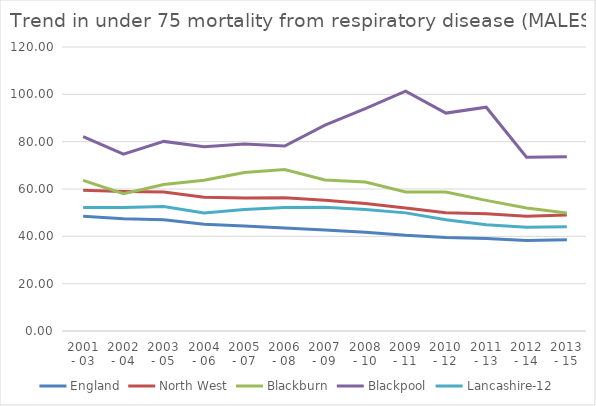
| Category | England | North West | Blackburn | Blackpool | Lancashire-12 |
|---|---|---|---|---|---|
| 2001 - 03 | 48.453 | 59.449 | 63.632 | 82.172 | 52.187 |
| 2002 - 04 | 47.378 | 58.928 | 57.981 | 74.717 | 52.146 |
| 2003 - 05 | 47 | 58.705 | 61.86 | 80.114 | 52.574 |
| 2004 - 06 | 45.102 | 56.473 | 63.704 | 77.807 | 49.911 |
| 2005 - 07 | 44.318 | 56.237 | 66.928 | 78.968 | 51.302 |
| 2006 - 08 | 43.498 | 56.285 | 68.271 | 78.138 | 52.191 |
| 2007 - 09 | 42.721 | 55.204 | 63.843 | 86.974 | 52.334 |
| 2008 - 10 | 41.747 | 53.85 | 62.979 | 93.922 | 51.33 |
| 2009 - 11 | 40.428 | 51.997 | 58.708 | 101.304 | 49.91 |
| 2010 - 12 | 39.553 | 49.948 | 58.71 | 92.079 | 47.021 |
| 2011 - 13 | 39.104 | 49.508 | 55.196 | 94.567 | 44.932 |
| 2012 - 14 | 38.251 | 48.512 | 51.971 | 73.437 | 43.882 |
| 2013 - 15 | 38.51 | 49.063 | 49.891 | 73.578 | 44.009 |